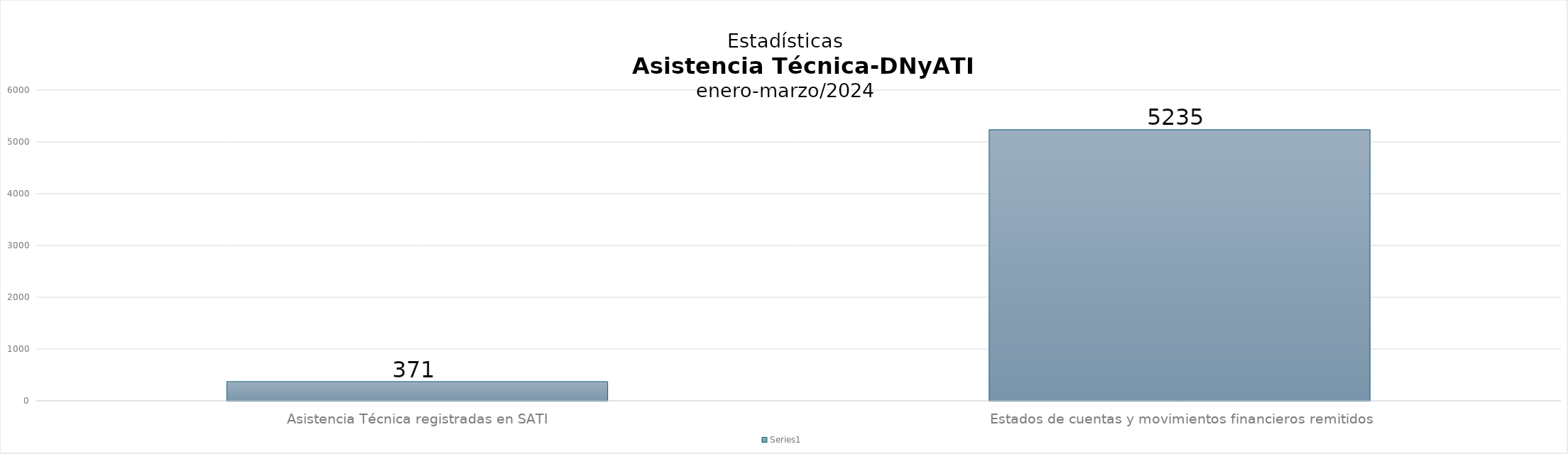
| Category | Series 0 |
|---|---|
| Asistencia Técnica registradas en SATI | 371 |
| Estados de cuentas y movimientos financieros remitidos | 5235 |